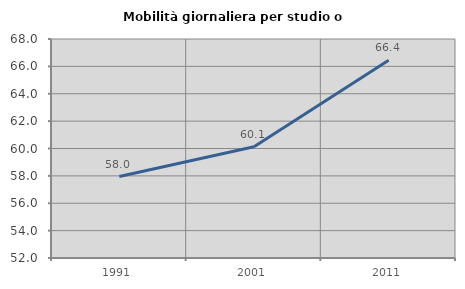
| Category | Mobilità giornaliera per studio o lavoro |
|---|---|
| 1991.0 | 57.952 |
| 2001.0 | 60.127 |
| 2011.0 | 66.442 |